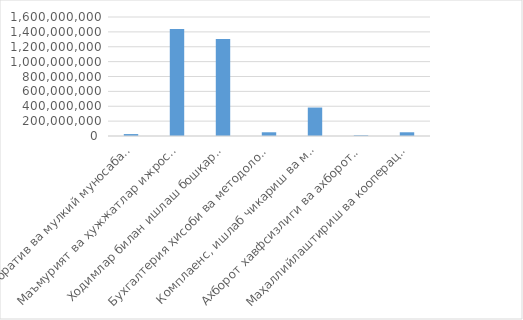
| Category | Товар / хизматнинг
жами суммаси
(cумда) 
(ҚҚС билан) |
|---|---|
| Корпоратив ва мулкий муносабатлар бошқармаси | 26000000 |
| Маъмурият ва ҳужжатлар ижроси назорати бошқармаси | 1439300000 |
| Ходимлар билан ишлаш бошқармаси | 1304496000 |
| Бухгалтерия ҳисоби ва методология бошқармаси | 50000000 |
| Комплаенс, ишлаб чикариш ва молиявий хавфларни мониторинг қилиш департаменти | 382664000 |
| Ахборот хавфсизлиги ва ахборот технологияларини ривожлантириш бошқармаси | 9500000 |
| Маҳаллийлаштириш ва кооперация алоқаларини ривожлантириш бошқармаси | 50000000 |